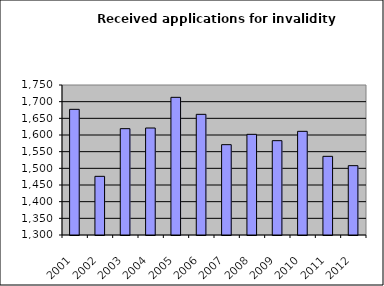
| Category | Series 1 |
|---|---|
| 2001.0 | 1677 |
| 2002.0 | 1476 |
| 2003.0 | 1619 |
| 2004.0 | 1621 |
| 2005.0 | 1713 |
| 2006.0 | 1662 |
| 2007.0 | 1571 |
| 2008.0 | 1602 |
| 2009.0 | 1583 |
| 2010.0 | 1611 |
| 2011.0 | 1536 |
| 2012.0 | 1508 |